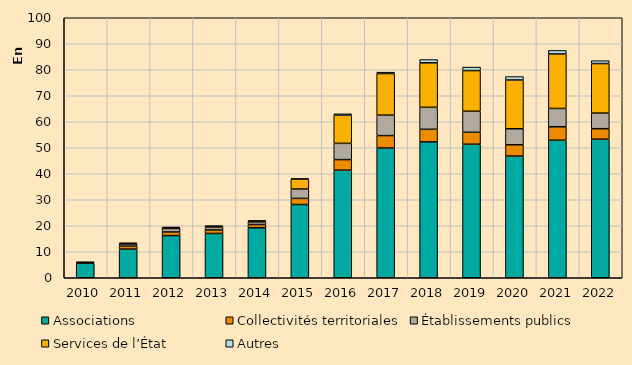
| Category | Associations | Collectivités territoriales | Établissements publics | Services de l’État | Autres |
|---|---|---|---|---|---|
| 2010.0 | 5566 | 251 | 114 | 0 | 77 |
| 2011.0 | 11023 | 1134 | 837 | 180 | 229 |
| 2012.0 | 16215 | 1391 | 1331 | 337 | 208 |
| 2013.0 | 17034 | 1356 | 1069 | 345 | 142 |
| 2014.0 | 19217 | 1243 | 1019 | 355 | 91 |
| 2015.0 | 28167 | 2357 | 3608 | 3763 | 305 |
| 2016.0 | 41376 | 4072 | 6238 | 10824 | 534 |
| 2017.0 | 49910 | 4769 | 7866 | 15999 | 525 |
| 2018.0 | 52267 | 4836 | 8447 | 17112 | 1263 |
| 2019.0 | 51369 | 4585 | 8102 | 15630 | 1337 |
| 2020.0 | 46810 | 4342 | 6153 | 18759 | 1327 |
| 2021.0 | 52906 | 5159 | 7048 | 20973 | 1345 |
| 2022.0 | 53282 | 4046 | 5998 | 19062 | 1109 |